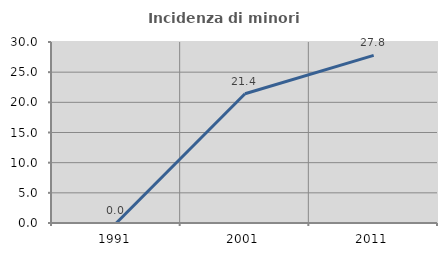
| Category | Incidenza di minori stranieri |
|---|---|
| 1991.0 | 0 |
| 2001.0 | 21.429 |
| 2011.0 | 27.778 |